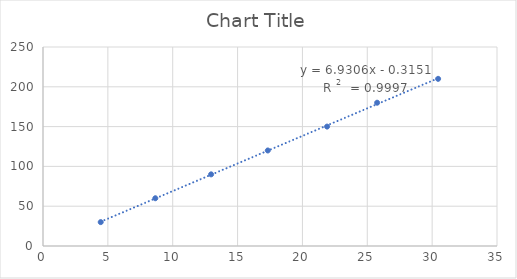
| Category | Series 0 |
|---|---|
| 4.45 | 30 |
| 8.66 | 60 |
| 12.96 | 90 |
| 17.33 | 120 |
| 21.9 | 150 |
| 25.76 | 180 |
| 30.46 | 210 |